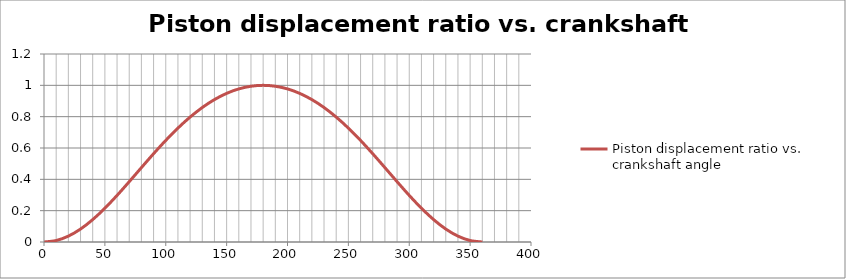
| Category | Piston displacement ratio vs. crankshaft angle |
|---|---|
| 0.0 | 0 |
| 10.0 | 0.009 |
| 20.0 | 0.037 |
| 30.0 | 0.083 |
| 40.0 | 0.143 |
| 50.0 | 0.216 |
| 60.0 | 0.297 |
| 70.0 | 0.385 |
| 80.0 | 0.475 |
| 90.0 | 0.564 |
| 100.0 | 0.648 |
| 110.0 | 0.727 |
| 120.0 | 0.797 |
| 130.0 | 0.858 |
| 140.0 | 0.909 |
| 150.0 | 0.949 |
| 160.0 | 0.977 |
| 170.0 | 0.994 |
| 180.0 | 1 |
| 190.0 | 0.994 |
| 200.0 | 0.977 |
| 210.0 | 0.949 |
| 220.0 | 0.909 |
| 230.0 | 0.858 |
| 240.0 | 0.797 |
| 250.0 | 0.727 |
| 260.0 | 0.648 |
| 270.0 | 0.564 |
| 280.0 | 0.475 |
| 290.0 | 0.385 |
| 300.0 | 0.297 |
| 310.0 | 0.216 |
| 320.0 | 0.143 |
| 330.0 | 0.083 |
| 340.0 | 0.037 |
| 350.0 | 0.009 |
| 360.0 | 0 |